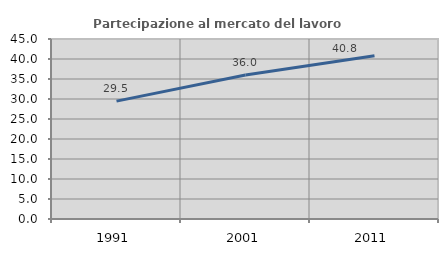
| Category | Partecipazione al mercato del lavoro  femminile |
|---|---|
| 1991.0 | 29.469 |
| 2001.0 | 35.983 |
| 2011.0 | 40.837 |